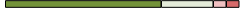
| Category | Series 0 | Series 1 | Series 2 | Series 3 |
|---|---|---|---|---|
| 0 | 12 | 4 | 1 | 1 |